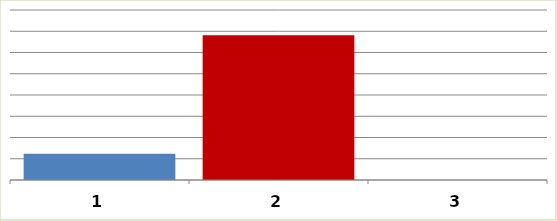
| Category | Series 0 |
|---|---|
| 0 | 12334553 |
| 1 | 68168351 |
| 2 | 0 |